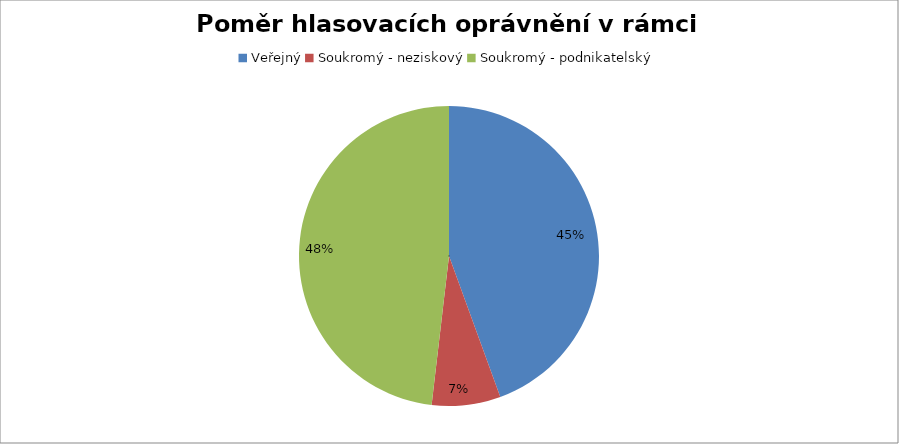
| Category | Series 0 |
|---|---|
| Veřejný | 0.444 |
| Soukromý - neziskový | 0.074 |
| Soukromý - podnikatelský | 0.481 |